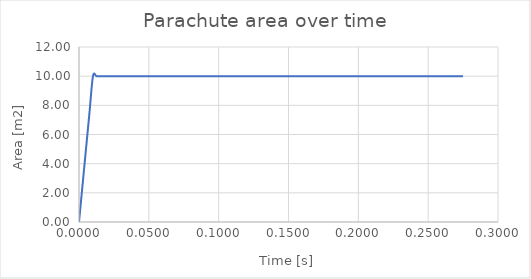
| Category | Parachute area |
|---|---|
| 0.0 | 0 |
| 0.0025 | 2.5 |
| 0.005 | 5 |
| 0.0075 | 7.5 |
| 0.01 | 10 |
| 0.0125 | 10 |
| 0.015000000000000001 | 10 |
| 0.0175 | 10 |
| 0.02 | 10 |
| 0.0225 | 10 |
| 0.024999999999999998 | 10 |
| 0.027499999999999997 | 10 |
| 0.029999999999999995 | 10 |
| 0.032499999999999994 | 10 |
| 0.034999999999999996 | 10 |
| 0.0375 | 10 |
| 0.04 | 10 |
| 0.0425 | 10 |
| 0.045000000000000005 | 10 |
| 0.04750000000000001 | 10 |
| 0.05000000000000001 | 10 |
| 0.05250000000000001 | 10 |
| 0.055000000000000014 | 10 |
| 0.057500000000000016 | 10 |
| 0.06000000000000002 | 10 |
| 0.06250000000000001 | 10 |
| 0.06500000000000002 | 10 |
| 0.06750000000000002 | 10 |
| 0.07000000000000002 | 10 |
| 0.07250000000000002 | 10 |
| 0.07500000000000002 | 10 |
| 0.07750000000000003 | 10 |
| 0.08000000000000003 | 10 |
| 0.08250000000000003 | 10 |
| 0.08500000000000003 | 10 |
| 0.08750000000000004 | 10 |
| 0.09000000000000004 | 10 |
| 0.09250000000000004 | 10 |
| 0.09500000000000004 | 10 |
| 0.09750000000000004 | 10 |
| 0.10000000000000005 | 10 |
| 0.10250000000000005 | 10 |
| 0.10500000000000005 | 10 |
| 0.10750000000000005 | 10 |
| 0.11000000000000006 | 10 |
| 0.11250000000000006 | 10 |
| 0.11500000000000006 | 10 |
| 0.11750000000000006 | 10 |
| 0.12000000000000006 | 10 |
| 0.12250000000000007 | 10 |
| 0.12500000000000006 | 10 |
| 0.12750000000000006 | 10 |
| 0.13000000000000006 | 10 |
| 0.13250000000000006 | 10 |
| 0.13500000000000006 | 10 |
| 0.13750000000000007 | 10 |
| 0.14000000000000007 | 10 |
| 0.14250000000000007 | 10 |
| 0.14500000000000007 | 10 |
| 0.14750000000000008 | 10 |
| 0.15000000000000008 | 10 |
| 0.15250000000000008 | 10 |
| 0.15500000000000008 | 10 |
| 0.15750000000000008 | 10 |
| 0.1600000000000001 | 10 |
| 0.1625000000000001 | 10 |
| 0.1650000000000001 | 10 |
| 0.1675000000000001 | 10 |
| 0.1700000000000001 | 10 |
| 0.1725000000000001 | 10 |
| 0.1750000000000001 | 10 |
| 0.1775000000000001 | 10 |
| 0.1800000000000001 | 10 |
| 0.1825000000000001 | 10 |
| 0.1850000000000001 | 10 |
| 0.1875000000000001 | 10 |
| 0.1900000000000001 | 10 |
| 0.19250000000000012 | 10 |
| 0.19500000000000012 | 10 |
| 0.19750000000000012 | 10 |
| 0.20000000000000012 | 10 |
| 0.20250000000000012 | 10 |
| 0.20500000000000013 | 10 |
| 0.20750000000000013 | 10 |
| 0.21000000000000013 | 10 |
| 0.21250000000000013 | 10 |
| 0.21500000000000014 | 10 |
| 0.21750000000000014 | 10 |
| 0.22000000000000014 | 10 |
| 0.22250000000000014 | 10 |
| 0.22500000000000014 | 10 |
| 0.22750000000000015 | 10 |
| 0.23000000000000015 | 10 |
| 0.23250000000000015 | 10 |
| 0.23500000000000015 | 10 |
| 0.23750000000000016 | 10 |
| 0.24000000000000016 | 10 |
| 0.24250000000000016 | 10 |
| 0.24500000000000016 | 10 |
| 0.24750000000000016 | 10 |
| 0.25000000000000017 | 10 |
| 0.25250000000000017 | 10 |
| 0.25500000000000017 | 10 |
| 0.2575000000000002 | 10 |
| 0.2600000000000002 | 10 |
| 0.2625000000000002 | 10 |
| 0.2650000000000002 | 10 |
| 0.2675000000000002 | 10 |
| 0.2700000000000002 | 10 |
| 0.2725000000000002 | 10 |
| 0.2750000000000002 | 10 |